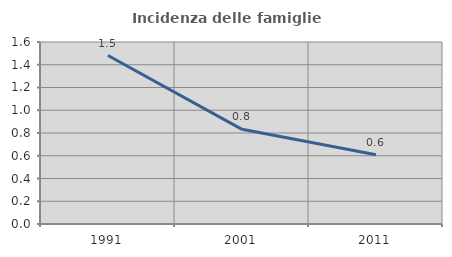
| Category | Incidenza delle famiglie numerose |
|---|---|
| 1991.0 | 1.481 |
| 2001.0 | 0.832 |
| 2011.0 | 0.609 |